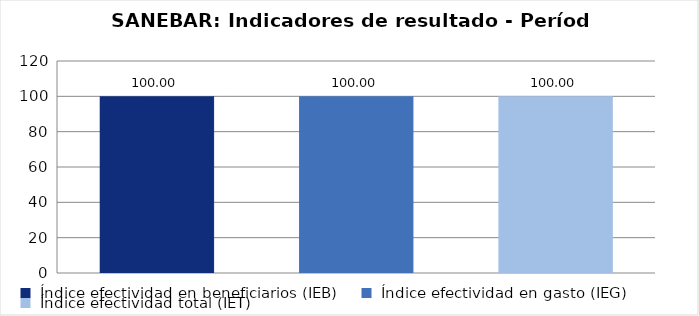
| Category | Total Programa |
|---|---|
| Índice efectividad en beneficiarios (IEB) | 100 |
| Índice efectividad en gasto (IEG)  | 100 |
| Índice efectividad total (IET) | 100 |